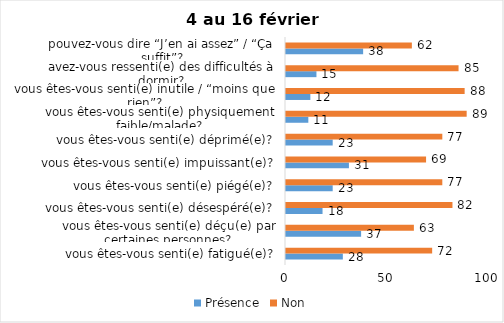
| Category | Présence | Non |
|---|---|---|
| vous êtes-vous senti(e) fatigué(e)? | 28 | 72 |
| vous êtes-vous senti(e) déçu(e) par certaines personnes? | 37 | 63 |
| vous êtes-vous senti(e) désespéré(e)? | 18 | 82 |
| vous êtes-vous senti(e) piégé(e)? | 23 | 77 |
| vous êtes-vous senti(e) impuissant(e)? | 31 | 69 |
| vous êtes-vous senti(e) déprimé(e)? | 23 | 77 |
| vous êtes-vous senti(e) physiquement faible/malade? | 11 | 89 |
| vous êtes-vous senti(e) inutile / “moins que rien”? | 12 | 88 |
| avez-vous ressenti(e) des difficultés à dormir? | 15 | 85 |
| pouvez-vous dire “J’en ai assez” / “Ça suffit”? | 38 | 62 |